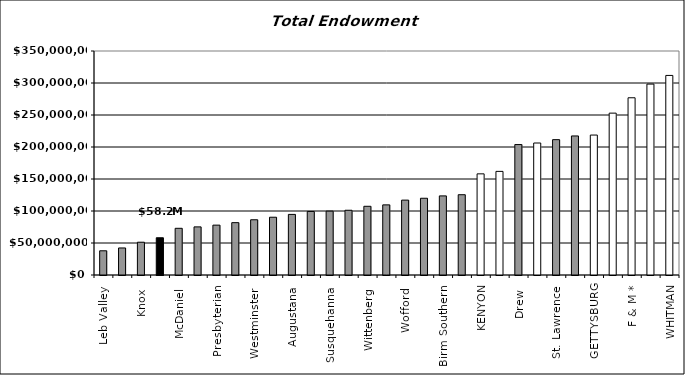
| Category | Endow FY05 |
|---|---|
| Leb Valley  | 37841604 |
| Elizabethtown  | 42239729 |
| Knox  | 51225973 |
| Juniata  | 58202010 |
| McDaniel  | 72952000 |
| Moravian | 75192497 |
| Presbyterian  | 77916000 |
| Wash & Jeff | 81800000 |
| Westminster  | 86318950 |
| Millsaps  | 90272000 |
| Augustana  | 94697726 |
| Muhlenberg  | 99315000 |
| Susquehanna  | 99785175 |
| Lycoming  | 101152965 |
| Wittenberg  | 107365948 |
| Ursinus  | 109572757 |
| Wofford  | 117000410 |
| Allegheny  | 119921619 |
| Birm Southern  | 123593848 |
| Washington  | 125457603 |
| KENYON | 158053202 |
| CENTRE | 161900880 |
| Drew  | 203825000 |
| DICKINSON | 206240165 |
| St. Lawrence  | 211477851 |
| C of Wooster | 217275524 |
| GETTYSBURG | 218654824 |
| SEWANEE | 252914245 |
| F & M * | 276919000 |
| UNION | 298300000 |
| WHITMAN | 311821131 |